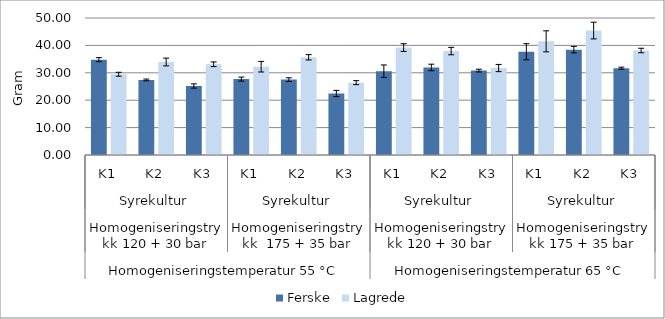
| Category | Ferske | Lagrede |
|---|---|---|
| 0 | 34.805 | 29.473 |
| 1 | 27.391 | 33.94 |
| 2 | 25.181 | 33.113 |
| 3 | 27.695 | 32.23 |
| 4 | 27.51 | 35.659 |
| 5 | 22.45 | 26.407 |
| 6 | 30.581 | 39.215 |
| 7 | 31.949 | 37.925 |
| 8 | 30.805 | 31.737 |
| 9 | 37.683 | 41.484 |
| 10 | 38.454 | 45.416 |
| 11 | 31.686 | 38.137 |